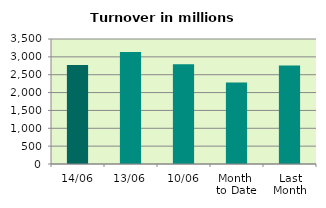
| Category | Series 0 |
|---|---|
| 14/06 | 2773.105 |
| 13/06 | 3135.732 |
| 10/06 | 2790.549 |
| Month 
to Date | 2283.372 |
| Last
Month | 2758.944 |